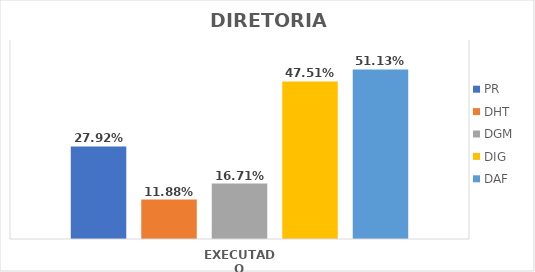
| Category | PR | DHT | DGM | DIG | DAF |
|---|---|---|---|---|---|
| EXECUTADO | 0.279 | 0.119 | 0.167 | 0.475 | 0.511 |